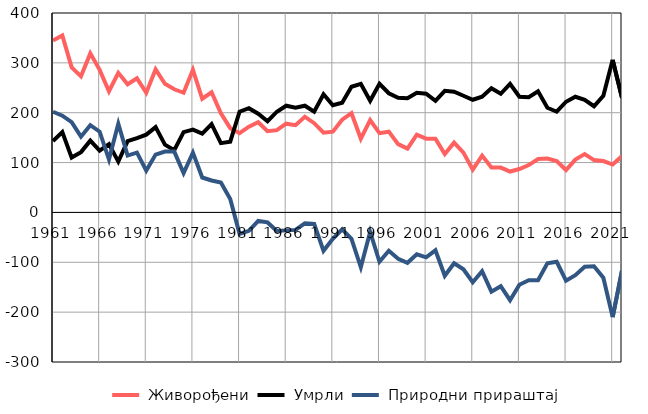
| Category |  Живорођени |  Умрли |  Природни прираштај |
|---|---|---|---|
| 1961.0 | 345 | 143 | 202 |
| 1962.0 | 355 | 161 | 194 |
| 1963.0 | 291 | 110 | 181 |
| 1964.0 | 273 | 121 | 152 |
| 1965.0 | 319 | 144 | 175 |
| 1966.0 | 286 | 124 | 162 |
| 1967.0 | 243 | 137 | 106 |
| 1968.0 | 280 | 102 | 178 |
| 1969.0 | 257 | 143 | 114 |
| 1970.0 | 269 | 149 | 120 |
| 1971.0 | 240 | 156 | 84 |
| 1972.0 | 287 | 171 | 116 |
| 1973.0 | 258 | 136 | 122 |
| 1974.0 | 247 | 125 | 122 |
| 1975.0 | 240 | 161 | 79 |
| 1976.0 | 286 | 166 | 120 |
| 1977.0 | 228 | 158 | 70 |
| 1978.0 | 241 | 177 | 64 |
| 1979.0 | 199 | 139 | 60 |
| 1980.0 | 169 | 142 | 27 |
| 1981.0 | 159 | 202 | -43 |
| 1982.0 | 172 | 209 | -37 |
| 1983.0 | 181 | 198 | -17 |
| 1984.0 | 163 | 183 | -20 |
| 1985.0 | 165 | 202 | -37 |
| 1986.0 | 178 | 214 | -36 |
| 1987.0 | 175 | 210 | -35 |
| 1988.0 | 192 | 214 | -22 |
| 1989.0 | 179 | 202 | -23 |
| 1990.0 | 160 | 237 | -77 |
| 1991.0 | 162 | 215 | -53 |
| 1992.0 | 186 | 220 | -34 |
| 1993.0 | 199 | 252 | -53 |
| 1994.0 | 148 | 258 | -110 |
| 1995.0 | 185 | 224 | -39 |
| 1996.0 | 159 | 258 | -99 |
| 1997.0 | 162 | 239 | -77 |
| 1998.0 | 137 | 230 | -93 |
| 1999.0 | 128 | 229 | -101 |
| 2000.0 | 156 | 240 | -84 |
| 2001.0 | 148 | 238 | -90 |
| 2002.0 | 148 | 224 | -76 |
| 2003.0 | 117 | 244 | -127 |
| 2004.0 | 140 | 242 | -102 |
| 2005.0 | 120 | 234 | -114 |
| 2006.0 | 86 | 226 | -140 |
| 2007.0 | 114 | 232 | -118 |
| 2008.0 | 90 | 249 | -159 |
| 2009.0 | 90 | 238 | -148 |
| 2010.0 | 82 | 258 | -176 |
| 2011.0 | 87 | 232 | -145 |
| 2012.0 | 95 | 231 | -136 |
| 2013.0 | 107 | 243 | -136 |
| 2014.0 | 108 | 210 | -102 |
| 2015.0 | 103 | 202 | -99 |
| 2016.0 | 85 | 222 | -137 |
| 2017.0 | 106 | 232 | -126 |
| 2018.0 | 117 | 226 | -109 |
| 2019.0 | 105 | 213 | -108 |
| 2020.0 | 103 | 234 | -131 |
| 2021.0 | 96 | 306 | -210 |
| 2022.0 | 113 | 230 | -117 |